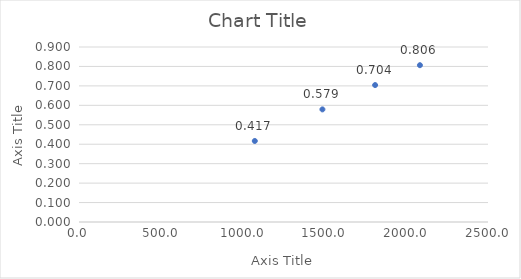
| Category | Series 0 |
|---|---|
| 1074.5666666666666 | 0.417 |
| 1487.8999999999999 | 0.579 |
| 1810.0 | 0.704 |
| 2083.9 | 0.806 |